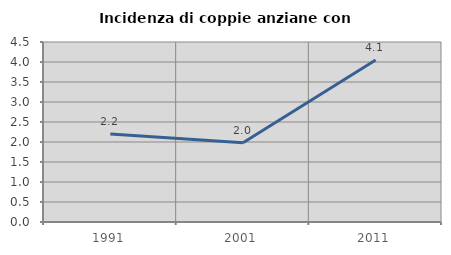
| Category | Incidenza di coppie anziane con figli |
|---|---|
| 1991.0 | 2.198 |
| 2001.0 | 1.983 |
| 2011.0 | 4.051 |